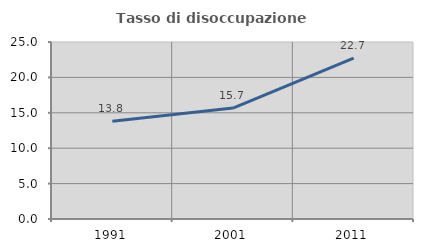
| Category | Tasso di disoccupazione giovanile  |
|---|---|
| 1991.0 | 13.793 |
| 2001.0 | 15.672 |
| 2011.0 | 22.727 |